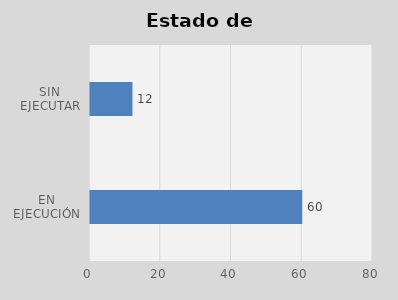
| Category | Total |
|---|---|
| EN EJECUCIÓN | 60 |
| SIN EJECUTAR | 12 |